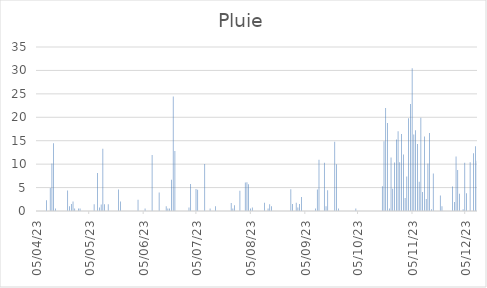
| Category | Pluie |
|---|---|
| 2023-04-05 | 0 |
| 2023-04-06 | 0 |
| 2023-04-07 | 0 |
| 2023-04-08 | 0 |
| 2023-04-09 | 0 |
| 2023-04-10 | 2.29 |
| 2023-04-11 | 0 |
| 2023-04-12 | 4.89 |
| 2023-04-13 | 10.16 |
| 2023-04-14 | 14.48 |
| 2023-04-15 | 0.51 |
| 2023-04-16 | 0 |
| 2023-04-17 | 0 |
| 2023-04-18 | 0 |
| 2023-04-19 | 0 |
| 2023-04-20 | 0 |
| 2023-04-21 | 0 |
| 2023-04-22 | 4.38 |
| 2023-04-23 | 1.02 |
| 2023-04-24 | 1.52 |
| 2023-04-25 | 2.03 |
| 2023-04-26 | 0.51 |
| 2023-04-27 | 0 |
| 2023-04-28 | 0.51 |
| 2023-04-29 | 0.51 |
| 2023-04-30 | 0 |
| 2023-05-01 | 0 |
| 2023-05-02 | 0 |
| 2023-05-03 | 0 |
| 2023-05-04 | 0 |
| 2023-05-05 | 0 |
| 2023-05-06 | 0 |
| 2023-05-07 | 1.46 |
| 2023-05-08 | 0 |
| 2023-05-09 | 8.13 |
| 2023-05-10 | 0.76 |
| 2023-05-11 | 1.4 |
| 2023-05-12 | 13.27 |
| 2023-05-13 | 1.46 |
| 2023-05-14 | 0 |
| 2023-05-15 | 1.46 |
| 2023-05-16 | 0 |
| 2023-05-17 | 0 |
| 2023-05-18 | 0 |
| 2023-05-19 | 0 |
| 2023-05-20 | 0 |
| 2023-05-21 | 4.57 |
| 2023-05-22 | 2.03 |
| 2023-05-23 | 0 |
| 2023-05-24 | 0 |
| 2023-05-25 | 0 |
| 2023-05-26 | 0 |
| 2023-05-27 | 0 |
| 2023-05-28 | 0 |
| 2023-05-29 | 0 |
| 2023-05-30 | 0 |
| 2023-05-31 | 0 |
| 2023-06-01 | 2.41 |
| 2023-06-02 | 0 |
| 2023-06-03 | 0 |
| 2023-06-04 | 0 |
| 2023-06-05 | 0.51 |
| 2023-06-06 | 0 |
| 2023-06-07 | 0 |
| 2023-06-08 | 0 |
| 2023-06-09 | 11.94 |
| 2023-06-10 | 0 |
| 2023-06-11 | 0 |
| 2023-06-12 | 0 |
| 2023-06-13 | 3.94 |
| 2023-06-14 | 0 |
| 2023-06-15 | 0 |
| 2023-06-16 | 0 |
| 2023-06-17 | 1.02 |
| 2023-06-18 | 0.51 |
| 2023-06-19 | 0.51 |
| 2023-06-20 | 6.67 |
| 2023-06-21 | 24.45 |
| 2023-06-22 | 12.83 |
| 2023-06-23 | 0 |
| 2023-06-24 | 0 |
| 2023-06-25 | 0 |
| 2023-06-26 | 0 |
| 2023-06-27 | 0 |
| 2023-06-28 | 0 |
| 2023-06-29 | 0 |
| 2023-06-30 | 0.76 |
| 2023-07-01 | 5.78 |
| 2023-07-02 | 0 |
| 2023-07-03 | 0 |
| 2023-07-04 | 4.7 |
| 2023-07-05 | 4.51 |
| 2023-07-06 | 0 |
| 2023-07-07 | 0 |
| 2023-07-08 | 0 |
| 2023-07-09 | 10.03 |
| 2023-07-10 | 0 |
| 2023-07-11 | 0 |
| 2023-07-12 | 0.51 |
| 2023-07-13 | 0 |
| 2023-07-14 | 0 |
| 2023-07-15 | 1.02 |
| 2023-07-16 | 0 |
| 2023-07-17 | 0 |
| 2023-07-18 | 0 |
| 2023-07-19 | 0 |
| 2023-07-20 | 0 |
| 2023-07-21 | 0 |
| 2023-07-22 | 0 |
| 2023-07-23 | 0 |
| 2023-07-24 | 1.71 |
| 2023-07-25 | 0.51 |
| 2023-07-26 | 1.21 |
| 2023-07-27 | 0 |
| 2023-07-28 | 0 |
| 2023-07-29 | 4.32 |
| 2023-07-30 | 0 |
| 2023-07-31 | 0 |
| 2023-08-01 | 6.1 |
| 2023-08-02 | 6.16 |
| 2023-08-03 | 5.72 |
| 2023-08-04 | 0.51 |
| 2023-08-05 | 0.76 |
| 2023-08-06 | 0 |
| 2023-08-07 | 0 |
| 2023-08-08 | 0 |
| 2023-08-09 | 0 |
| 2023-08-10 | 0 |
| 2023-08-11 | 0 |
| 2023-08-12 | 1.78 |
| 2023-08-13 | 0 |
| 2023-08-14 | 0.51 |
| 2023-08-15 | 1.46 |
| 2023-08-16 | 1.02 |
| 2023-08-17 | 0 |
| 2023-08-18 | 0 |
| 2023-08-19 | 0 |
| 2023-08-20 | 0 |
| 2023-08-21 | 0 |
| 2023-08-22 | 0 |
| 2023-08-23 | 0 |
| 2023-08-24 | 0 |
| 2023-08-25 | 0 |
| 2023-08-26 | 0 |
| 2023-08-27 | 4.64 |
| 2023-08-28 | 1.52 |
| 2023-08-29 | 0 |
| 2023-08-30 | 1.78 |
| 2023-08-31 | 0.76 |
| 2023-09-01 | 1.52 |
| 2023-09-02 | 2.98 |
| 2023-09-03 | 0 |
| 2023-09-04 | 0 |
| 2023-09-05 | 0 |
| 2023-09-06 | 0 |
| 2023-09-07 | 0 |
| 2023-09-08 | 0 |
| 2023-09-09 | 0 |
| 2023-09-10 | 0.51 |
| 2023-09-11 | 4.57 |
| 2023-09-12 | 10.92 |
| 2023-09-13 | 0 |
| 2023-09-14 | 0 |
| 2023-09-15 | 10.29 |
| 2023-09-16 | 1.02 |
| 2023-09-17 | 4.45 |
| 2023-09-18 | 0 |
| 2023-09-19 | 0 |
| 2023-09-20 | 0 |
| 2023-09-21 | 14.8 |
| 2023-09-22 | 9.97 |
| 2023-09-23 | 0.51 |
| 2023-09-24 | 0 |
| 2023-09-25 | 0 |
| 2023-09-26 | 0 |
| 2023-09-27 | 0 |
| 2023-09-28 | 0 |
| 2023-09-29 | 0 |
| 2023-09-30 | 0 |
| 2023-10-01 | 0 |
| 2023-10-02 | 0 |
| 2023-10-03 | 0.51 |
| 2023-10-04 | 0 |
| 2023-10-05 | 0 |
| 2023-10-06 | 0 |
| 2023-10-07 | 0 |
| 2023-10-08 | 0 |
| 2023-10-09 | 0 |
| 2023-10-10 | 0 |
| 2023-10-11 | 0 |
| 2023-10-12 | 0 |
| 2023-10-13 | 0 |
| 2023-10-14 | 0 |
| 2023-10-15 | 0 |
| 2023-10-16 | 0 |
| 2023-10-17 | 0 |
| 2023-10-18 | 5.27 |
| 2023-10-19 | 14.86 |
| 2023-10-20 | 21.97 |
| 2023-10-21 | 18.8 |
| 2023-10-22 | 0.51 |
| 2023-10-23 | 11.43 |
| 2023-10-24 | 4.76 |
| 2023-10-25 | 10.35 |
| 2023-10-26 | 15.24 |
| 2023-10-27 | 17.02 |
| 2023-10-28 | 10.41 |
| 2023-10-29 | 16.45 |
| 2023-10-30 | 12.07 |
| 2023-10-31 | 2.79 |
| 2023-11-01 | 7.37 |
| 2023-11-02 | 19.81 |
| 2023-11-03 | 22.86 |
| 2023-11-04 | 30.48 |
| 2023-11-05 | 16.32 |
| 2023-11-06 | 17.21 |
| 2023-11-07 | 14.29 |
| 2023-11-08 | 6.22 |
| 2023-11-09 | 19.88 |
| 2023-11-10 | 4.06 |
| 2023-11-11 | 15.88 |
| 2023-11-12 | 2.54 |
| 2023-11-13 | 10.16 |
| 2023-11-14 | 16.64 |
| 2023-11-15 | 0.38 |
| 2023-11-16 | 8 |
| 2023-11-17 | 0 |
| 2023-11-18 | 0 |
| 2023-11-19 | 0 |
| 2023-11-20 | 3.3 |
| 2023-11-21 | 1.02 |
| 2023-11-22 | 0 |
| 2023-11-23 | 0 |
| 2023-11-24 | 0 |
| 2023-11-25 | 0 |
| 2023-11-26 | 0 |
| 2023-11-27 | 5.21 |
| 2023-11-28 | 1.91 |
| 2023-11-29 | 11.62 |
| 2023-11-30 | 8.76 |
| 2023-12-01 | 3.68 |
| 2023-12-02 | 0 |
| 2023-12-03 | 0.38 |
| 2023-12-04 | 10.29 |
| 2023-12-05 | 3.81 |
| 2023-12-06 | 0 |
| 2023-12-07 | 10.41 |
| 2023-12-08 | 0 |
| 2023-12-09 | 12.32 |
| 2023-12-10 | 13.84 |
| 2023-12-11 | 10.73 |